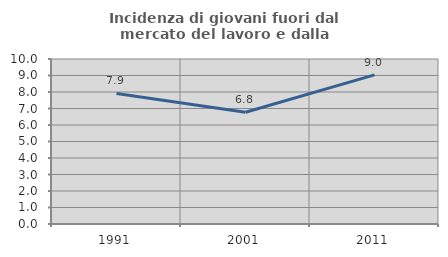
| Category | Incidenza di giovani fuori dal mercato del lavoro e dalla formazione  |
|---|---|
| 1991.0 | 7.913 |
| 2001.0 | 6.773 |
| 2011.0 | 9.036 |